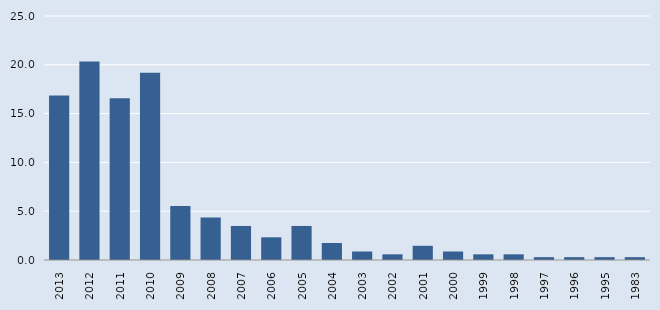
| Category | Series 0 |
|---|---|
| 2013.0 | 16.86 |
| 2012.0 | 20.349 |
| 2011.0 | 16.57 |
| 2010.0 | 19.186 |
| 2009.0 | 5.523 |
| 2008.0 | 4.36 |
| 2007.0 | 3.488 |
| 2006.0 | 2.326 |
| 2005.0 | 3.488 |
| 2004.0 | 1.744 |
| 2003.0 | 0.872 |
| 2002.0 | 0.581 |
| 2001.0 | 1.453 |
| 2000.0 | 0.872 |
| 1999.0 | 0.581 |
| 1998.0 | 0.581 |
| 1997.0 | 0.291 |
| 1996.0 | 0.291 |
| 1995.0 | 0.291 |
| 1983.0 | 0.291 |